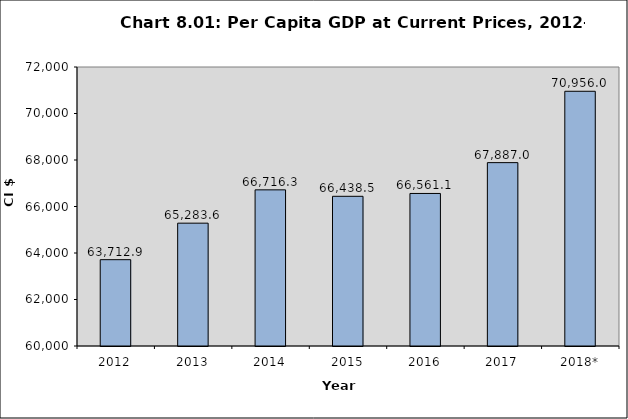
| Category | Series 0 |
|---|---|
| 2012 | 63712.899 |
| 2013 | 65283.559 |
| 2014 | 66716.312 |
| 2015 | 66438.463 |
| 2016 | 66561.128 |
| 2017 | 67887.034 |
| 2018* | 70956 |